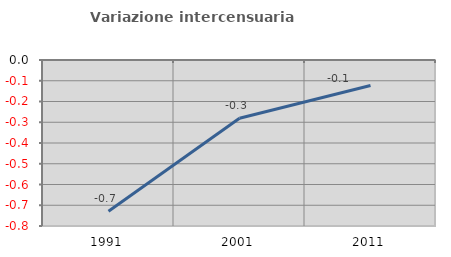
| Category | Variazione intercensuaria annua |
|---|---|
| 1991.0 | -0.729 |
| 2001.0 | -0.281 |
| 2011.0 | -0.123 |